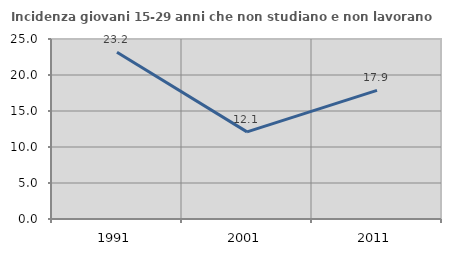
| Category | Incidenza giovani 15-29 anni che non studiano e non lavorano  |
|---|---|
| 1991.0 | 23.155 |
| 2001.0 | 12.099 |
| 2011.0 | 17.859 |